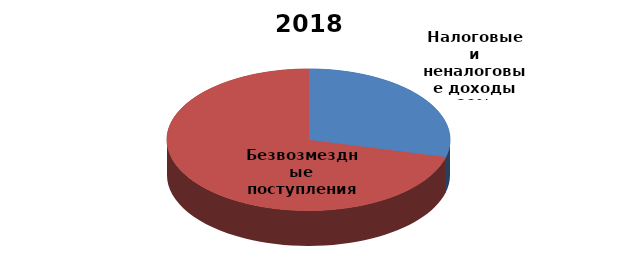
| Category | 2018 год |
|---|---|
| Налоговые и неналоговые доходы | 445697.6 |
| Безвозмездные поступления | 1095063.9 |